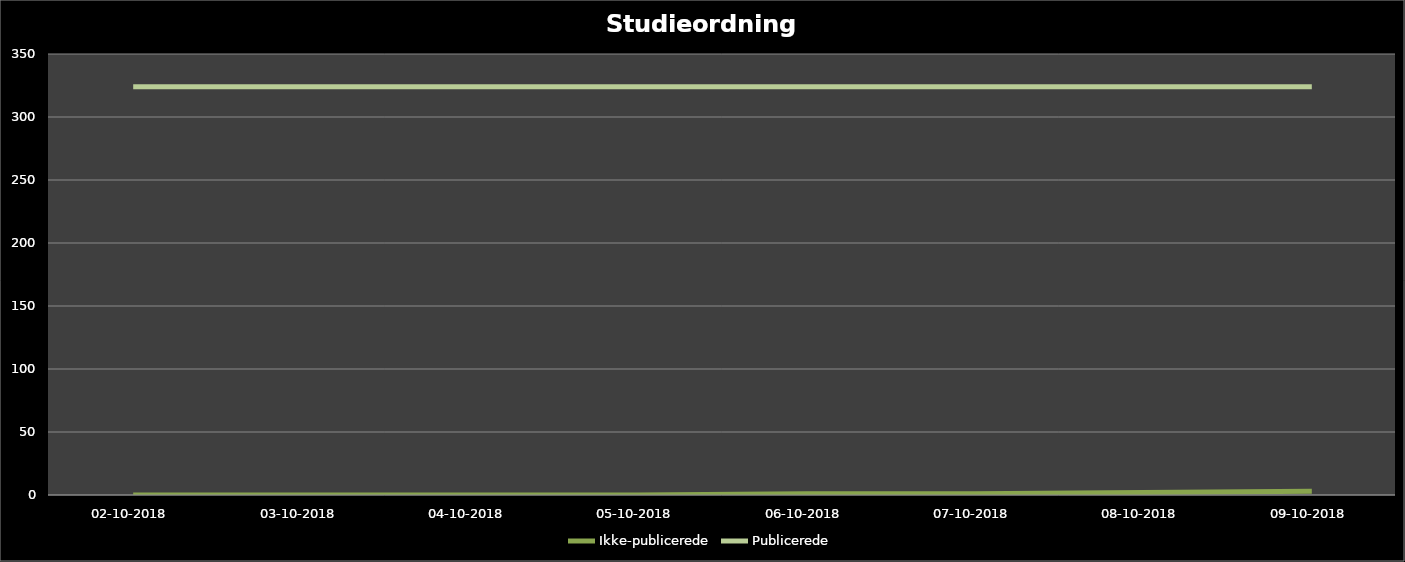
| Category | Ikke-publicerede | Publicerede |
|---|---|---|
| 02-10-2018 | 0 | 324 |
| 03-10-2018 | 0 | 324 |
| 04-10-2018 | 0 | 324 |
| 05-10-2018 | 0 | 324 |
| 06-10-2018 | 1 | 324 |
| 07-10-2018 | 1 | 324 |
| 08-10-2018 | 2 | 324 |
| 09-10-2018 | 3 | 324 |